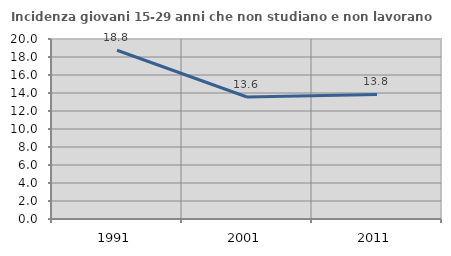
| Category | Incidenza giovani 15-29 anni che non studiano e non lavorano  |
|---|---|
| 1991.0 | 18.75 |
| 2001.0 | 13.556 |
| 2011.0 | 13.834 |